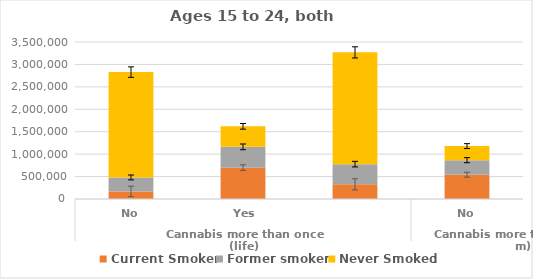
| Category | Current Smoker | Former smoker | Never Smoked |
|---|---|---|---|
| 0 | 168623 | 312250 | 2348023 |
| 1 | 699213 | 463118 | 457588 |
| 2 | 326333 | 450711 | 2491746 |
| 3 | 541504 | 324130 | 313866 |